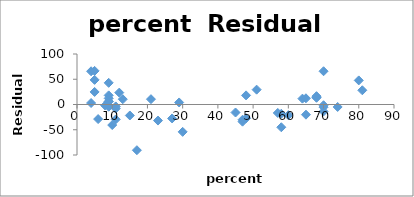
| Category | Series 0 |
|---|---|
| 8.0 | -2.068 |
| 47.0 | -30.212 |
| 27.0 | -27.625 |
| 6.0 | -28.86 |
| 45.0 | -15.848 |
| 29.0 | 4.03 |
| 81.0 | 28.164 |
| 68.0 | 13.32 |
| 48.0 | -27.227 |
| 65.0 | -20.17 |
| 57.0 | -16.755 |
| 15.0 | -21.751 |
| 13.0 | 10.519 |
| 58.0 | -18.337 |
| 5.0 | 48.733 |
| 9.0 | 12.179 |
| 11.0 | -29.526 |
| 9.0 | -2.531 |
| 68.0 | 16.495 |
| 64.0 | 11.596 |
| 80.0 | 47.688 |
| 11.0 | -8.007 |
| 9.0 | 42.937 |
| 4.0 | 2.937 |
| 9.0 | 6.237 |
| 21.0 | 10.549 |
| 9.0 | 5.587 |
| 30.0 | -54.149 |
| 70.0 | 65.865 |
| 70.0 | -13.748 |
| 11.0 | -3.82 |
| 74.0 | -4.88 |
| 60.0 | -21.083 |
| 5.0 | 66.571 |
| 23.0 | -31.783 |
| 9.0 | -4.42 |
| 51.0 | 29.408 |
| 70.0 | -5.312 |
| 70.0 | -1.424 |
| 58.0 | -45.076 |
| 5.0 | 24.855 |
| 12.0 | 23.516 |
| 47.0 | -34.005 |
| 4.0 | 65.766 |
| 68.0 | 14.433 |
| 65.0 | 12.293 |
| 48.0 | 18.085 |
| 17.0 | -90.531 |
| 9.0 | 18.043 |
| 10.0 | -40.657 |